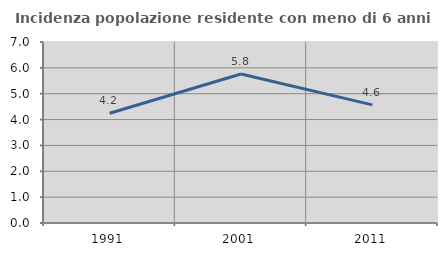
| Category | Incidenza popolazione residente con meno di 6 anni |
|---|---|
| 1991.0 | 4.244 |
| 2001.0 | 5.763 |
| 2011.0 | 4.568 |